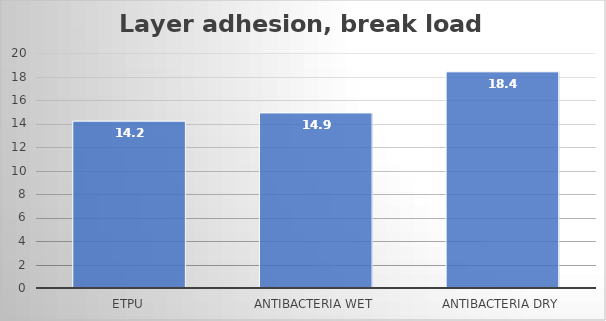
| Category | Average |
|---|---|
| eTPU | 14.2 |
| Antibacteria wet | 14.9 |
| Antibacteria dry | 18.4 |